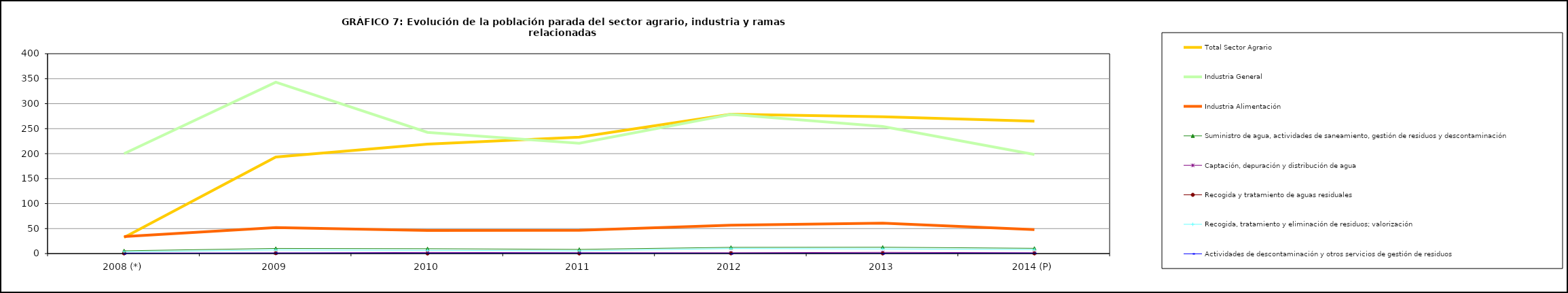
| Category | Total Sector Agrario | Industria General | Industria Alimentación | Suministro de agua, actividades de saneamiento, gestión de residuos y descontaminación  | Captación, depuración y distribución de agua         | Recogida y tratamiento de aguas residuales                                                                                 | Recogida, tratamiento y eliminación de residuos; valorización       | Actividades de descontaminación y otros servicios de gestión de residuos  |
|---|---|---|---|---|---|---|---|---|
| 2008 (*) | 32.3 | 199.925 | 34 | 5.55 | 1.075 | 0.425 | 3.4 | 0.625 |
| 2009 | 193.25 | 343.025 | 52 | 10.275 | 1.275 | 0.825 | 7.225 | 0.95 |
| 2010 | 218.925 | 242.575 | 46.15 | 9.725 | 2.25 | 0.225 | 6.475 | 0.8 |
| 2011 | 233.075 | 220.925 | 46.525 | 8.375 | 1.675 | 0.325 | 5.45 | 0.85 |
| 2012 | 278.9 | 278.675 | 56.8 | 12.475 | 1.6 | 0.5 | 9.975 | 0.45 |
| 2013 | 273.925 | 254.3 | 60.8 | 12.7 | 2.4 | 0.3 | 9.3 | 0.6 |
| 2014 (P) | 265.1 | 198.3 | 47.85 | 10.5 | 1.6 | 0.4 | 7.9 | 0.8 |